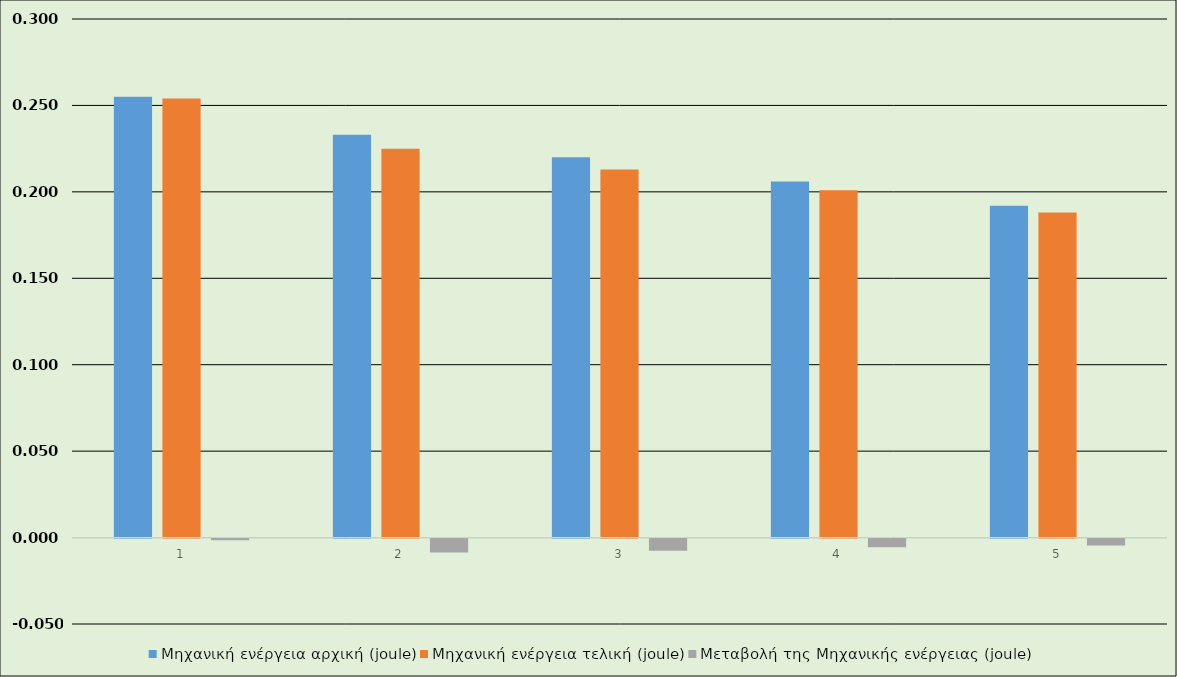
| Category | Μηχανική ενέργεια αρχική (joule) | Μηχανική ενέργεια τελική (joule) | Μεταβολή της Μηχανικής ενέργειας (joule) |
|---|---|---|---|
| 0 | 0.255 | 0.254 | -0.001 |
| 1 | 0.233 | 0.225 | -0.008 |
| 2 | 0.22 | 0.213 | -0.007 |
| 3 | 0.206 | 0.201 | -0.005 |
| 4 | 0.192 | 0.188 | -0.004 |